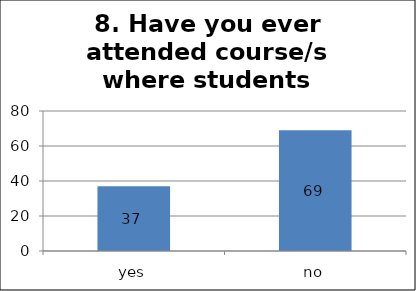
| Category | Series 0 |
|---|---|
| yes | 37 |
| no | 69 |